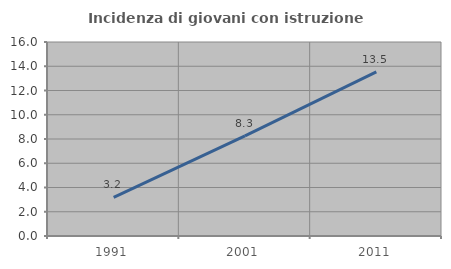
| Category | Incidenza di giovani con istruzione universitaria |
|---|---|
| 1991.0 | 3.182 |
| 2001.0 | 8.257 |
| 2011.0 | 13.542 |